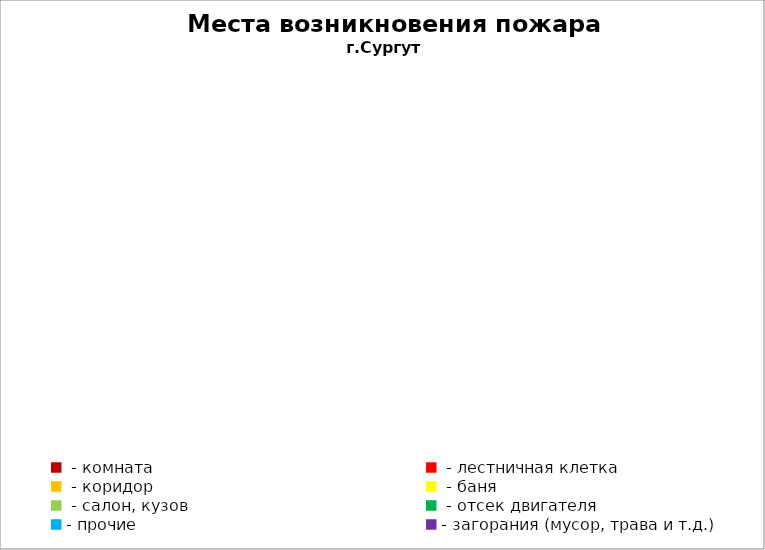
| Category | Места возникновения пожара |
|---|---|
|  - комната | 51 |
|  - лестничная клетка | 23 |
|  - коридор | 4 |
|  - баня | 37 |
|  - салон, кузов | 20 |
|  - отсек двигателя | 28 |
| - прочие | 86 |
| - загорания (мусор, трава и т.д.)  | 159 |